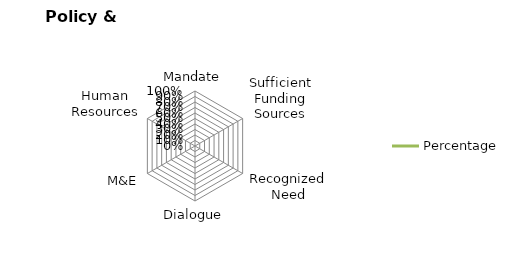
| Category | Percentage |
|---|---|
| Mandate | 0 |
| Sufficient Funding Sources | 0 |
| Recognized Need | 0 |
| Dialogue | 0 |
| M&E | 0 |
| Human Resources | 0 |